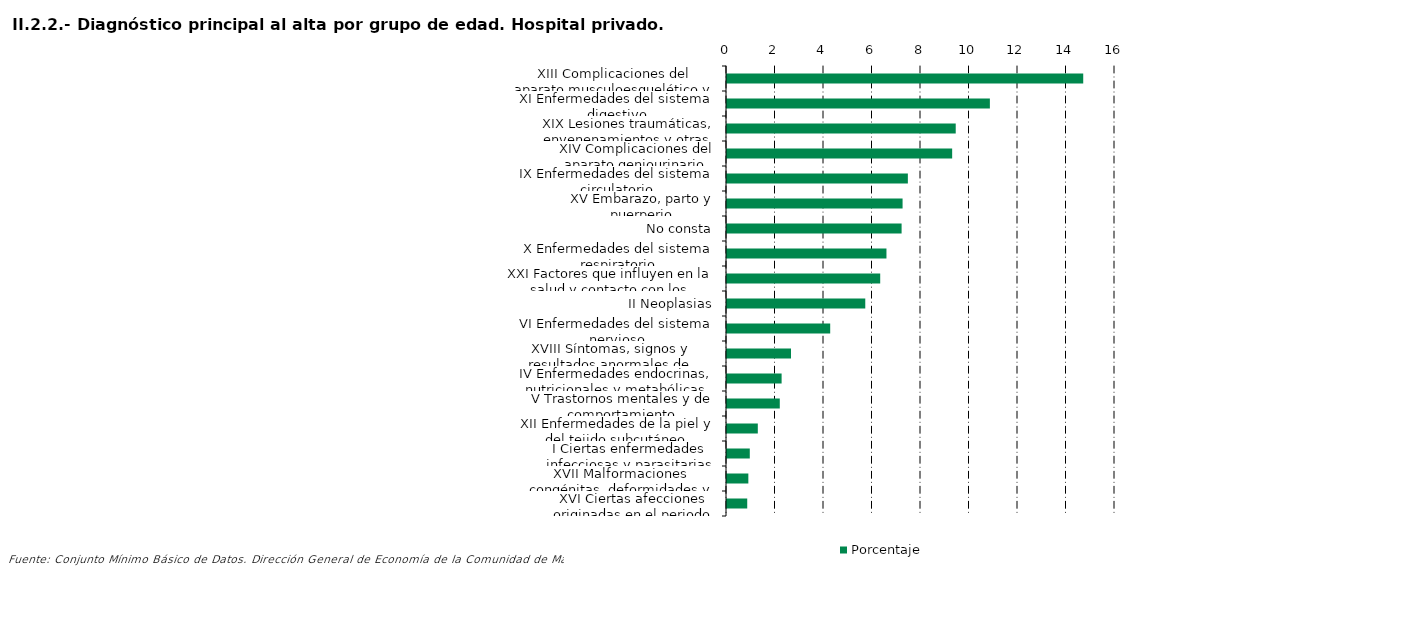
| Category | Porcentaje |
|---|---|
| XIII Complicaciones del aparato musculoesquelético y del tejido conectivo | 14.69 |
| XI Enfermedades del sistema digestivo | 10.84 |
| XIX Lesiones traumáticas, envenenamientos y otras consecuencias de causas externas | 9.432 |
| XIV Complicaciones del aparato geniourinario | 9.285 |
| IX Enfermedades del sistema circulatorio | 7.458 |
| XV Embarazo, parto y puerperio | 7.24 |
| No consta | 7.2 |
| X Enfermedades del sistema respiratorio | 6.576 |
| XXI Factores que influyen en la salud y contacto con los servicios sanitarios | 6.318 |
| II Neoplasias | 5.702 |
| VI Enfermedades del sistema nervioso | 4.256 |
| XVIII Síntomas, signos y resultados anormales de pruebas complementarias, no clasificados bajo otro concepto | 2.639 |
| IV Enfermedades endocrinas, nutricionales y metabólicas | 2.252 |
| V Trastornos mentales y de comportamiento | 2.177 |
| XII Enfermedades de la piel y del tejido subcutáneo | 1.27 |
| I Ciertas enfermedades infecciosas y parasitarias | 0.94 |
| XVII Malformaciones congénitas, deformidades y anomalías cromosómicas | 0.88 |
| XVI Ciertas afecciones originadas en el periodo perinatal | 0.834 |